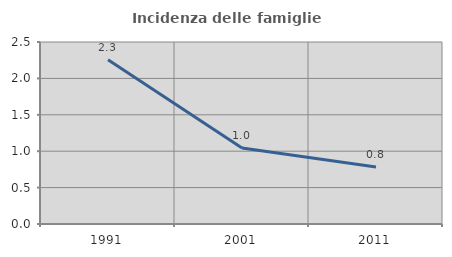
| Category | Incidenza delle famiglie numerose |
|---|---|
| 1991.0 | 2.257 |
| 2001.0 | 1.043 |
| 2011.0 | 0.784 |